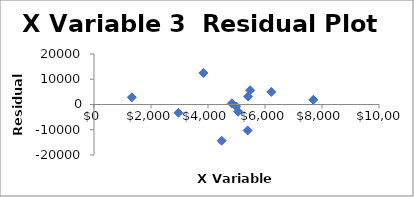
| Category | Series 0 |
|---|---|
| 5406.370185677444 | 3179.001 |
| 7694.170269300274 | 1862.122 |
| 6220.488409786126 | 4978.237 |
| 5478.149377877208 | 5661.135 |
| 5054.835008417648 | -2855.446 |
| 3836.6041237896825 | 12503.956 |
| 5392.193577132886 | -10273.226 |
| 4836.4527058372705 | 474.834 |
| 2962.82766591769 | -3281.13 |
| 4992.772427329863 | -755.657 |
| 4479.51906484007 | -14334.44 |
| 1327.701811071826 | 2840.615 |